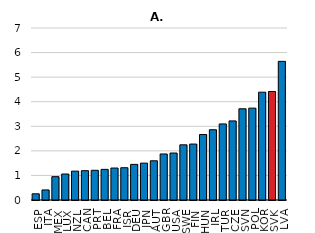
| Category | données triées |
|---|---|
| ESP | 0.252 |
| ITA | 0.409 |
| MEX | 0.95 |
| LUX | 1.058 |
| NZL | 1.174 |
| CAN | 1.194 |
| PRT | 1.209 |
| BEL | 1.247 |
| FRA | 1.301 |
| ISR | 1.314 |
| DEU | 1.449 |
| JPN | 1.5 |
| AUT | 1.596 |
| GBR | 1.873 |
| USA | 1.912 |
| SWE | 2.246 |
| FIN | 2.277 |
| HUN | 2.665 |
| IRL | 2.859 |
| TUR | 3.095 |
| CZE | 3.218 |
| SVN | 3.712 |
| POL | 3.739 |
| KOR | 4.387 |
| SVK | 4.415 |
| LVA | 5.643 |